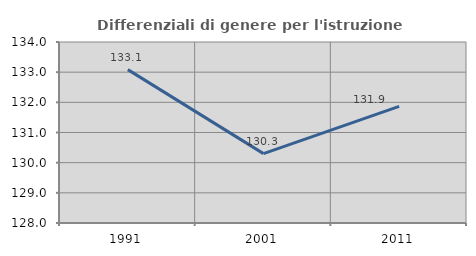
| Category | Differenziali di genere per l'istruzione superiore |
|---|---|
| 1991.0 | 133.085 |
| 2001.0 | 130.299 |
| 2011.0 | 131.868 |